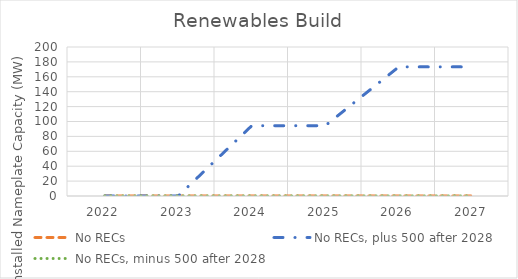
| Category | No RECs | No RECs, plus 500 after 2028 | No RECs, minus 500 after 2028 |
|---|---|---|---|
| 2022.0 | 0 | 0 | 0 |
| 2023.0 | 0 | 0 | 0 |
| 2024.0 | 0 | 94.333 | 0 |
| 2025.0 | 0 | 94.333 | 0 |
| 2026.0 | 0 | 173.333 | 0 |
| 2027.0 | 0 | 173.333 | 0 |